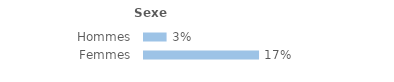
| Category | Series 0 |
|---|---|
| Hommes | 0.034 |
| Femmes | 0.172 |